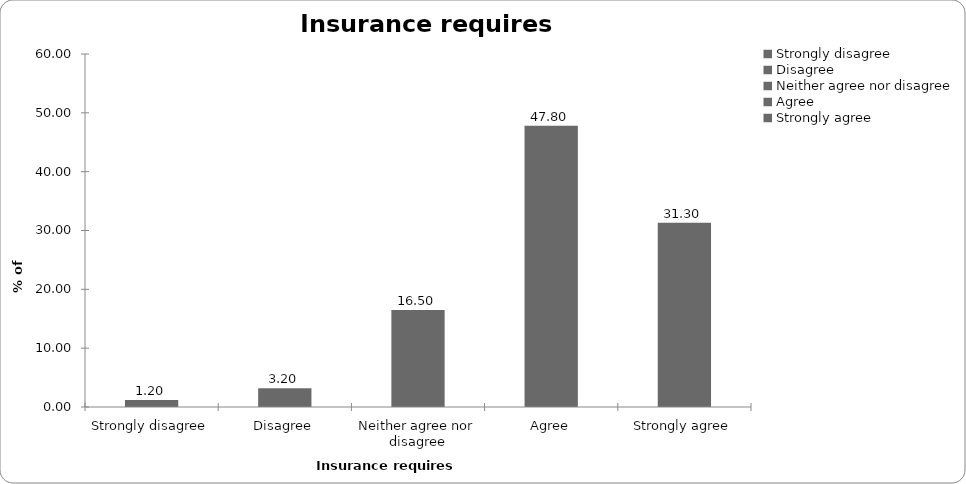
| Category | Insurance requires regulation |
|---|---|
| Strongly disagree | 1.2 |
| Disagree | 3.2 |
| Neither agree nor disagree | 16.5 |
| Agree | 47.8 |
| Strongly agree | 31.3 |